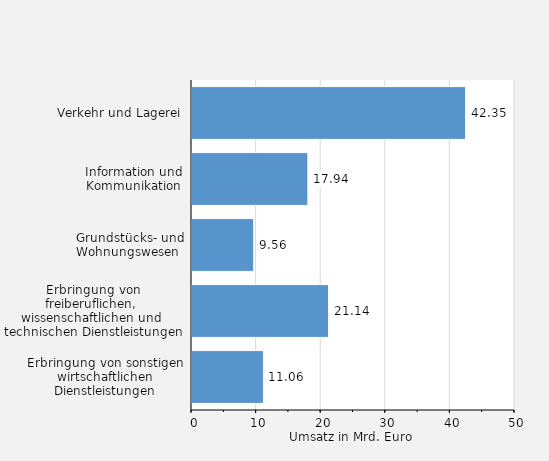
| Category | Umsatz in Mrd. Euro |
|---|---|
| Verkehr und Lagerei | 42.346 |
| Information und Kommunikation | 17.939 |
| Grundstücks- und Wohnungswesen  | 9.555 |
| Erbringung von freiberuflichen, 
wissenschaftlichen und 
technischen Dienstleistungen | 21.143 |
| Erbringung von sonstigen wirtschaftlichen Dienstleistungen | 11.058 |